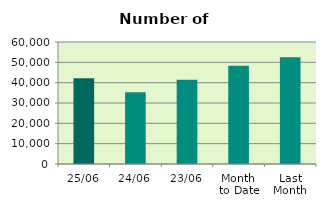
| Category | Series 0 |
|---|---|
| 25/06 | 42138 |
| 24/06 | 35238 |
| 23/06 | 41408 |
| Month 
to Date | 48344 |
| Last
Month | 52506.1 |